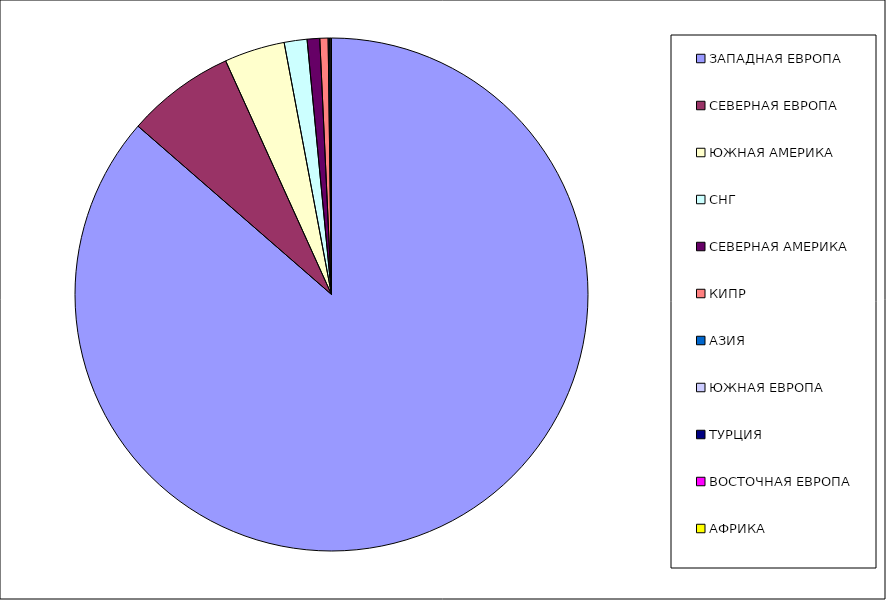
| Category | Оборот |
|---|---|
| ЗАПАДНАЯ ЕВРОПА | 0.864 |
| СЕВЕРНАЯ ЕВРОПА | 0.068 |
| ЮЖНАЯ АМЕРИКА | 0.038 |
| СНГ | 0.014 |
| СЕВЕРНАЯ АМЕРИКА | 0.008 |
| КИПР | 0.005 |
| АЗИЯ | 0.001 |
| ЮЖНАЯ ЕВРОПА | 0.001 |
| ТУРЦИЯ | 0 |
| ВОСТОЧНАЯ ЕВРОПА | 0 |
| АФРИКА | 0 |